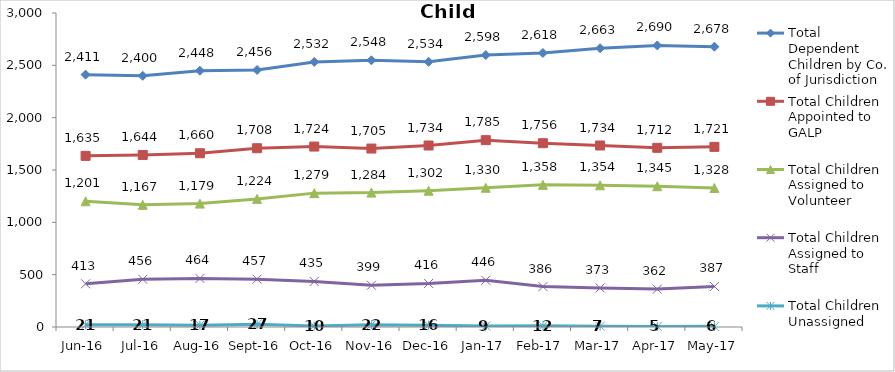
| Category | Total Dependent Children by Co. of Jurisdiction | Total Children Appointed to GALP | Total Children Assigned to Volunteer | Total Children Assigned to Staff | Total Children Unassigned |
|---|---|---|---|---|---|
| Jun-16 | 2411 | 1635 | 1201 | 413 | 21 |
| Jul-16 | 2400 | 1644 | 1167 | 456 | 21 |
| Aug-16 | 2448 | 1660 | 1179 | 464 | 17 |
| Sep-16 | 2456 | 1708 | 1224 | 457 | 27 |
| Oct-16 | 2532 | 1724 | 1279 | 435 | 10 |
| Nov-16 | 2548 | 1705 | 1284 | 399 | 22 |
| Dec-16 | 2534 | 1734 | 1302 | 416 | 16 |
| Jan-17 | 2598 | 1785 | 1330 | 446 | 9 |
| Feb-17 | 2618 | 1756 | 1358 | 386 | 12 |
| Mar-17 | 2663 | 1734 | 1354 | 373 | 7 |
| Apr-17 | 2690 | 1712 | 1345 | 362 | 5 |
| May-17 | 2678 | 1721 | 1328 | 387 | 6 |